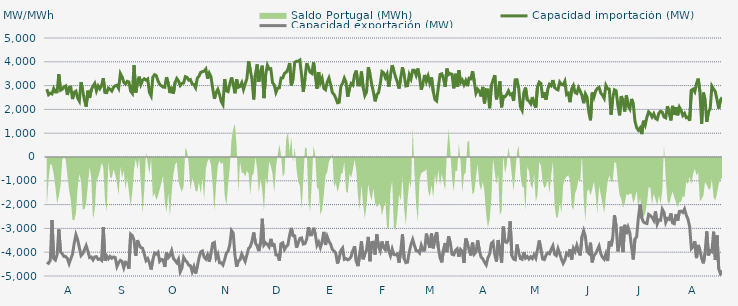
| Category | Capacidad importación (MW) | Capacidad exportación (MW) |
|---|---|---|
| 0 | 2850 | -4423.125 |
| 1900-01-01 | 2617.5 | -4466.25 |
| 1900-01-02 | 2681.25 | -4346.25 |
| 1900-01-03 | 2650 | -2650 |
| 1900-01-04 | 2876.25 | -4267.5 |
| 1900-01-05 | 2733.333 | -4333.125 |
| 1900-01-06 | 2735.625 | -4098.75 |
| 1900-01-07 | 3479.167 | -3041.667 |
| 1900-01-08 | 2805 | -3984.375 |
| 1900-01-09 | 2846.25 | -4065 |
| 1900-01-10 | 2941.875 | -4177.5 |
| 1900-01-11 | 2985 | -4183.125 |
| 1900-01-12 | 2606.25 | -4265.625 |
| 1900-01-13 | 2921.25 | -4481.25 |
| 1900-01-14 | 2938.125 | -4273.125 |
| 1900-01-15 | 2435 | -4091.25 |
| 1900-01-16 | 2716.875 | -3618.75 |
| 1900-01-17 | 2767.5 | -3264.375 |
| 1900-01-18 | 2476.875 | -3474.375 |
| 1900-01-19 | 2349.375 | -3798.75 |
| 1900-01-20 | 3142.5 | -4141.875 |
| 1900-01-21 | 2773.125 | -4066.875 |
| 1900-01-22 | 2390.625 | -3896.25 |
| 1900-01-23 | 2113.125 | -3723.75 |
| 1900-01-24 | 2786.25 | -3954.375 |
| 1900-01-25 | 2480.625 | -4226.25 |
| 1900-01-26 | 2829.375 | -4203.75 |
| 1900-01-27 | 2973.75 | -4323.75 |
| 1900-01-28 | 3090 | -4200 |
| 1900-01-29 | 2778.75 | -4186.875 |
| 1900-01-30 | 2986.875 | -4305 |
| 1900-01-31 | 2868.75 | -4282.5 |
| 1900-02-01 | 3000 | -4340.625 |
| 1900-02-02 | 3307.5 | -2947.5 |
| 1900-02-03 | 2713.125 | -4359.375 |
| 1900-02-04 | 2701.875 | -4158.75 |
| 1900-02-05 | 2896.875 | -4276.875 |
| 1900-02-06 | 2842.5 | -4177.5 |
| 1900-02-07 | 2773.125 | -4254.375 |
| 1900-02-08 | 2930.625 | -4201.875 |
| 1900-02-09 | 2990.625 | -4224.375 |
| 1900-02-10 | 3015 | -4603.125 |
| 1900-02-11 | 2883.75 | -4436.25 |
| 1900-02-12 | 3506.25 | -4342.5 |
| 1900-02-13 | 3367.5 | -4393.125 |
| 1900-02-14 | 3144.375 | -4653.75 |
| 1900-02-15 | 3063.75 | -4419.375 |
| 1900-02-16 | 3178.125 | -4456.875 |
| 1900-02-17 | 3153.75 | -4695 |
| 1900-02-18 | 2768.542 | -3240.125 |
| 1900-02-19 | 2672.083 | -3304.625 |
| 1900-02-20 | 3855 | -3498.75 |
| 1900-02-21 | 2703.125 | -4151.25 |
| 1900-02-22 | 3123.333 | -3495.125 |
| 1900-02-23 | 3376.875 | -3697.5 |
| 1900-02-24 | 3048.75 | -3805.875 |
| 1900-02-25 | 3225 | -3836.25 |
| 1900-02-26 | 3286.875 | -4085.625 |
| 1900-02-27 | 3230.625 | -4353.75 |
| 1900-02-28 | 3279.375 | -4267.5 |
| 1900-02-28 | 2704.917 | -4449.375 |
| 1900-03-01 | 2563.833 | -4725 |
| 1900-03-02 | 3360 | -4325.625 |
| 1900-03-03 | 3457.5 | -4035 |
| 1900-03-04 | 3420 | -4078.125 |
| 1900-03-05 | 3202.5 | -4005 |
| 1900-03-06 | 3050.625 | -4383.75 |
| 1900-03-07 | 2992.5 | -4301.25 |
| 1900-03-08 | 2938.125 | -4320 |
| 1900-03-09 | 2928.75 | -4614.375 |
| 1900-03-10 | 3356.25 | -4010.625 |
| 1900-03-11 | 3093.75 | -4231.875 |
| 1900-03-12 | 2686.875 | -4143.75 |
| 1900-03-13 | 2947.5 | -3935.625 |
| 1900-03-14 | 2664.375 | -4254.375 |
| 1900-03-15 | 3127.5 | -4350 |
| 1900-03-16 | 3300 | -4443.75 |
| 1900-03-17 | 3198.542 | -4296 |
| 1900-03-18 | 3001.875 | -4828.125 |
| 1900-03-19 | 3088.125 | -4666.875 |
| 1900-03-20 | 3110.625 | -4215 |
| 1900-03-21 | 3373.125 | -4336.875 |
| 1900-03-22 | 3345 | -4417.5 |
| 1900-03-23 | 3226.875 | -4541.25 |
| 1900-03-24 | 3251.25 | -4569.375 |
| 1900-03-25 | 3069.375 | -4816.875 |
| 1900-03-26 | 3046.875 | -4610.625 |
| 1900-03-27 | 2910 | -4897.5 |
| 1900-03-28 | 3309.375 | -4593.75 |
| 1900-03-29 | 3399.792 | -4243 |
| 1900-03-30 | 3556.875 | -3988.125 |
| 1900-03-31 | 3585.6 | -3948.08 |
| 1900-04-01 | 3605.625 | -4208.542 |
| 1900-04-02 | 3697.5 | -4290 |
| 1900-04-03 | 3291.25 | -4115.625 |
| 1900-04-04 | 3523.125 | -4398.75 |
| 1900-04-05 | 3371.25 | -4055.625 |
| 1900-04-06 | 2883.75 | -3628.125 |
| 1900-04-07 | 2445 | -3590.625 |
| 1900-04-08 | 2711.25 | -4233.75 |
| 1900-04-09 | 2842.292 | -4080 |
| 1900-04-10 | 2631.042 | -4443.75 |
| 1900-04-11 | 2333.542 | -4443.75 |
| 1900-04-12 | 2201.25 | -4537.5 |
| 1900-04-13 | 3275.625 | -4314.375 |
| 1900-04-14 | 2778.75 | -4038.75 |
| 1900-04-15 | 2749.167 | -3955 |
| 1900-04-16 | 3064.375 | -3696.875 |
| 1900-04-17 | 3341.083 | -3091.583 |
| 1900-04-18 | 3070.042 | -3200 |
| 1900-04-19 | 2678.625 | -4117.917 |
| 1900-04-20 | 3264.375 | -4610.625 |
| 1900-04-21 | 2928.75 | -4363.125 |
| 1900-04-22 | 2966.25 | -4316.25 |
| 1900-04-23 | 3121.875 | -4074.375 |
| 1900-04-24 | 2836.875 | -4230 |
| 1900-04-25 | 3078.75 | -4385.625 |
| 1900-04-26 | 3281.25 | -4121.25 |
| 1900-04-27 | 4027.5 | -3836.25 |
| 1900-04-28 | 3646.875 | -3765 |
| 1900-04-29 | 3256.875 | -3536.25 |
| 1900-04-30 | 2419.833 | -3170.625 |
| 1900-05-01 | 3472.5 | -3611.25 |
| 1900-05-02 | 3890.625 | -3742.5 |
| 1900-05-03 | 3166.875 | -3954.375 |
| 1900-05-04 | 3577.5 | -3583.125 |
| 1900-05-05 | 3836 | -2595.625 |
| 1900-05-06 | 2475 | -3700 |
| 1900-05-07 | 3466.875 | -3605.625 |
| 1900-05-08 | 3856.875 | -3676.458 |
| 1900-05-09 | 3697.5 | -3778.125 |
| 1900-05-10 | 3708.75 | -3440.625 |
| 1900-05-11 | 3125.625 | -3712.5 |
| 1900-05-12 | 3026.792 | -3685.625 |
| 1900-05-13 | 2711.458 | -4111.875 |
| 1900-05-14 | 2894.583 | -4117.5 |
| 1900-05-15 | 2908.583 | -4353.75 |
| 1900-05-16 | 3321.875 | -3639.375 |
| 1900-05-17 | 3324.375 | -3603.75 |
| 1900-05-18 | 3515.833 | -3886.875 |
| 1900-05-19 | 3562.5 | -3763.125 |
| 1900-05-20 | 3684.792 | -3688.125 |
| 1900-05-21 | 3950.625 | -3281.25 |
| 1900-05-22 | 3006.042 | -2979.375 |
| 1900-05-23 | 3276.667 | -3305.625 |
| 1900-05-24 | 3978.75 | -3315 |
| 1900-05-25 | 4018.125 | -3806.25 |
| 1900-05-26 | 4020 | -3611.25 |
| 1900-05-27 | 4072.5 | -3421.458 |
| 1900-05-28 | 3435 | -3400.208 |
| 1900-05-29 | 2733.458 | -3658.125 |
| 1900-05-30 | 3328.542 | -3637.5 |
| 1900-05-31 | 3937.5 | -3451.875 |
| 1900-06-01 | 3746.25 | -2948.958 |
| 1900-06-02 | 3564.375 | -3273.75 |
| 1900-06-03 | 3513.75 | -3266.25 |
| 1900-06-04 | 3975 | -2973.75 |
| 1900-06-05 | 3418.125 | -3228.75 |
| 1900-06-06 | 2868.75 | -3712.5 |
| 1900-06-07 | 3568.125 | -3577.5 |
| 1900-06-08 | 3120 | -3802.5 |
| 1900-06-09 | 3305.625 | -3564.375 |
| 1900-06-10 | 2884.375 | -3145.875 |
| 1900-06-11 | 2826.25 | -3695.625 |
| 1900-06-12 | 3149.792 | -3346.875 |
| 1900-06-13 | 3321.458 | -3540 |
| 1900-06-14 | 3048.75 | -3665.625 |
| 1900-06-15 | 2704.25 | -3881.25 |
| 1900-06-16 | 2627.25 | -3950.625 |
| 1900-06-17 | 2475.708 | -4038.75 |
| 1900-06-18 | 2277.917 | -4477.5 |
| 1900-06-19 | 2300 | -4239.375 |
| 1900-06-20 | 2972.708 | -3928.125 |
| 1900-06-21 | 3093.75 | -3825 |
| 1900-06-22 | 3313.333 | -4297.5 |
| 1900-06-23 | 3141.75 | -4268.125 |
| 1900-06-24 | 2533.125 | -4321.875 |
| 1900-06-25 | 2863.375 | -4282.5 |
| 1900-06-26 | 3088.125 | -4185 |
| 1900-06-27 | 3024.375 | -3931.875 |
| 1900-06-28 | 3459.375 | -3751.875 |
| 1900-06-29 | 3630 | -4380 |
| 1900-06-30 | 3020.625 | -4586.25 |
| 1900-07-01 | 3020.625 | -4091.25 |
| 1900-07-02 | 3592.5 | -3540 |
| 1900-07-03 | 2925 | -4297.5 |
| 1900-07-04 | 2582.625 | -4080.542 |
| 1900-07-05 | 2730 | -3900.625 |
| 1900-07-06 | 3769.167 | -3357.25 |
| 1900-07-07 | 3498.625 | -4380 |
| 1900-07-08 | 3058.125 | -3591.583 |
| 1900-07-09 | 2735.625 | -3581.875 |
| 1900-07-10 | 2339.792 | -4096.875 |
| 1900-07-11 | 2622.625 | -3250.667 |
| 1900-07-12 | 2697.5 | -3770.625 |
| 1900-07-13 | 3064.167 | -3943.625 |
| 1900-07-14 | 3588.75 | -3549.375 |
| 1900-07-15 | 3535.75 | -3810 |
| 1900-07-16 | 3333.958 | -3898.125 |
| 1900-07-17 | 3486.625 | -3530.542 |
| 1900-07-18 | 2951.375 | -3943.125 |
| 1900-07-19 | 3439.375 | -4149.375 |
| 1900-07-20 | 3860.625 | -3864.375 |
| 1900-07-21 | 3609.583 | -4100.625 |
| 1900-07-22 | 3359.75 | -4110 |
| 1900-07-23 | 3152.25 | -4073.75 |
| 1900-07-24 | 2876.25 | -4441.875 |
| 1900-07-25 | 3331.25 | -3948.75 |
| 1900-07-26 | 3768.75 | -3251.25 |
| 1900-07-27 | 3435.667 | -4269.375 |
| 1900-07-28 | 2984.167 | -4438.125 |
| 1900-07-29 | 2998.583 | -4415.625 |
| 1900-07-30 | 3457.333 | -3980.625 |
| 1900-07-31 | 3283.042 | -3676.875 |
| 1900-08-01 | 3641.25 | -3464.5 |
| 1900-08-02 | 3640.708 | -3708.75 |
| 1900-08-03 | 3435.708 | -3937.5 |
| 1900-08-04 | 3718.125 | -3943.125 |
| 1900-08-05 | 3344.458 | -4031.25 |
| 1900-08-06 | 2827.083 | -3710.625 |
| 1900-08-07 | 3113.75 | -3920.625 |
| 1900-08-08 | 3448.125 | -3913.125 |
| 1900-08-09 | 3172.083 | -3219.375 |
| 1900-08-10 | 3397.5 | -3562.5 |
| 1900-08-11 | 3101.042 | -3819.375 |
| 1900-08-12 | 3341.25 | -3215.625 |
| 1900-08-13 | 2760.833 | -3838.125 |
| 1900-08-14 | 2417.5 | -3395.625 |
| 1900-08-15 | 2354.583 | -3155.625 |
| 1900-08-16 | 2936.875 | -3811.875 |
| 1900-08-17 | 3468.75 | -4241.25 |
| 1900-08-18 | 3495 | -4426.875 |
| 1900-08-19 | 3297.083 | -3890.625 |
| 1900-08-20 | 2946.292 | -3613.125 |
| 1900-08-21 | 3714.792 | -3997.5 |
| 1900-08-22 | 3460.833 | -3331.875 |
| 1900-08-23 | 3502.917 | -3618.5 |
| 1900-08-24 | 3472.5 | -4089.375 |
| 1900-08-25 | 2885.87 | -4111.304 |
| 1900-08-26 | 3496.875 | -3930 |
| 1900-08-27 | 2942.5 | -3858.75 |
| 1900-08-28 | 3650.625 | -4194.375 |
| 1900-08-29 | 3122.458 | -3885 |
| 1900-08-30 | 3230.042 | -3961.875 |
| 1900-08-31 | 3034.208 | -4453.125 |
| 1900-09-01 | 3206.25 | -3423.75 |
| 1900-09-02 | 2977.5 | -3611.25 |
| 1900-09-03 | 3309.375 | -3911.25 |
| 1900-09-04 | 3288.75 | -4138.125 |
| 1900-09-05 | 3602.833 | -3596.25 |
| 1900-09-06 | 3174.375 | -4080 |
| 1900-09-07 | 2683.667 | -3991.875 |
| 1900-09-08 | 2848.875 | -3504.833 |
| 1900-09-09 | 2758.542 | -3938.333 |
| 1900-09-10 | 2545.417 | -4209.375 |
| 1900-09-11 | 2945.625 | -4278.75 |
| 1900-09-12 | 2252.5 | -4423.125 |
| 1900-09-13 | 2829.375 | -4533.75 |
| 1900-09-14 | 2820.917 | -4235.625 |
| 1900-09-15 | 2048.125 | -4081.208 |
| 1900-09-16 | 3003.75 | -3632.292 |
| 1900-09-17 | 3232.5 | -3565.625 |
| 1900-09-18 | 3440.625 | -4096.875 |
| 1900-09-19 | 2422.5 | -4393.125 |
| 1900-09-20 | 2763.958 | -3487.5 |
| 1900-09-21 | 3183.75 | -3943.125 |
| 1900-09-22 | 2087.083 | -4443.75 |
| 1900-09-23 | 2547 | -2925.75 |
| 1900-09-24 | 2531.667 | -3560.625 |
| 1900-09-25 | 2628.75 | -3590.625 |
| 1900-09-26 | 2778.75 | -3480 |
| 1900-09-27 | 2617.292 | -2701.792 |
| 1900-09-28 | 2655 | -4141.875 |
| 1900-09-29 | 2355.417 | -4288.125 |
| 1900-09-30 | 3240.75 | -4318.125 |
| 1900-10-01 | 3247.5 | -3676.875 |
| 1900-10-02 | 2878.042 | -4025.625 |
| 1900-10-03 | 2109.167 | -4269.375 |
| 1900-10-04 | 1961.042 | -4299.375 |
| 1900-10-05 | 2710.208 | -4003.125 |
| 1900-10-06 | 2916 | -4248.333 |
| 1900-10-07 | 2401.875 | -4179.375 |
| 1900-10-08 | 2351.25 | -4286.25 |
| 1900-10-09 | 2238.75 | -4192.5 |
| 1900-10-10 | 2520 | -4265.625 |
| 1900-10-11 | 2227.5 | -4108.125 |
| 1900-10-12 | 2070.583 | -4246.875 |
| 1900-10-13 | 2958.75 | -3892.5 |
| 1900-10-14 | 3146.25 | -3508.125 |
| 1900-10-15 | 3087.5 | -3877.5 |
| 1900-10-16 | 2487.5 | -4284.375 |
| 1900-10-17 | 2722.5 | -4310.625 |
| 1900-10-18 | 2411.25 | -4125 |
| 1900-10-19 | 2840.5 | -4025.625 |
| 1900-10-20 | 3054.5 | -4066.875 |
| 1900-10-21 | 2992.958 | -3879.375 |
| 1900-10-22 | 3232.5 | -3729.375 |
| 1900-10-23 | 2917.5 | -4085.625 |
| 1900-10-24 | 2853.75 | -4141.875 |
| 1900-10-25 | 2819.458 | -3849.375 |
| 1900-10-26 | 3145.042 | -4061.25 |
| 1900-10-27 | 3046.958 | -4290 |
| 1900-10-28 | 3028.125 | -4468.125 |
| 1900-10-29 | 3180.542 | -4331.25 |
| 1900-10-30 | 2624.958 | -4042.5 |
| 1900-10-31 | 2676.25 | -4115.625 |
| 1900-11-01 | 2302.5 | -3873.75 |
| 1900-11-02 | 2854.208 | -4308.75 |
| 1900-11-03 | 2997.833 | -3837.167 |
| 1900-11-04 | 2709.375 | -3973.125 |
| 1900-11-05 | 2670 | -3712.958 |
| 1900-11-06 | 2913.75 | -3958.125 |
| 1900-11-07 | 2765.625 | -4134.375 |
| 1900-11-08 | 2587.5 | -3352.5 |
| 1900-11-09 | 2261.25 | -3093.75 |
| 1900-11-10 | 2651.25 | -3345.208 |
| 1900-11-11 | 2510.625 | -3963.75 |
| 1900-11-12 | 1885.875 | -4044.375 |
| 1900-11-13 | 1541.5 | -3601.375 |
| 1900-11-14 | 2707.5 | -4426.875 |
| 1900-11-15 | 2516.25 | -4128.75 |
| 1900-11-16 | 2775 | -4059.375 |
| 1900-11-17 | 2883.75 | -3906.667 |
| 1900-11-18 | 2930.625 | -3742.5 |
| 1900-11-19 | 2685 | -4061.25 |
| 1900-11-20 | 2596.875 | -4213.125 |
| 1900-11-21 | 2463.75 | -4295.625 |
| 1900-11-22 | 3005.625 | -4065 |
| 1900-11-23 | 2861.25 | -4370.625 |
| 1900-11-24 | 2855.083 | -3533.583 |
| 1900-11-25 | 1775.625 | -3751.875 |
| 1900-11-26 | 2478.75 | -3391.875 |
| 1900-11-27 | 2821.875 | -2444.375 |
| 1900-11-28 | 2782.5 | -2903.75 |
| 1900-11-29 | 2169.375 | -3964.667 |
| 1900-11-30 | 1751.292 | -3614.625 |
| 1900-12-01 | 2561.25 | -2926.875 |
| 1900-12-02 | 2356.875 | -3995.625 |
| 1900-12-03 | 1911.125 | -2849.625 |
| 1900-12-04 | 2583.75 | -3240 |
| 1900-12-05 | 2157.125 | -2962.917 |
| 1900-12-06 | 2021.375 | -3195.625 |
| 1900-12-07 | 2439.375 | -3776.25 |
| 1900-12-08 | 2235 | -4305 |
| 1900-12-09 | 1509.375 | -3436.875 |
| 1900-12-10 | 1230.208 | -3360 |
| 1900-12-11 | 1123.125 | -2546.875 |
| 1900-12-12 | 1221.25 | -1995.875 |
| 1900-12-13 | 962.083 | -2563.125 |
| 1900-12-14 | 1523.958 | -2728.125 |
| 1900-12-15 | 1344.375 | -2776.875 |
| 1900-12-16 | 1676.25 | -2795.625 |
| 1900-12-17 | 1899.375 | -2411.25 |
| 1900-12-18 | 1826.25 | -2461.875 |
| 1900-12-19 | 1680 | -2529.375 |
| 1900-12-20 | 1815 | -2662.5 |
| 1900-12-21 | 1621.458 | -2287.5 |
| 1900-12-22 | 1577.083 | -2818.125 |
| 1900-12-23 | 1846.875 | -2643.75 |
| 1900-12-24 | 1923.75 | -2656.875 |
| 1900-12-25 | 1875 | -2195.625 |
| 1900-12-26 | 1683.75 | -2330.625 |
| 1900-12-27 | 1646.25 | -2746.875 |
| 1900-12-28 | 2137.5 | -2580.5 |
| 1900-12-29 | 1860 | -2620.625 |
| 1900-12-30 | 1537.5 | -2371.875 |
| 1900-12-31 | 2149.292 | -2771.25 |
| 1901-01-01 | 1766.25 | -2801.25 |
| 1901-01-02 | 2097.75 | -2405.625 |
| 1901-01-03 | 1753.125 | -2676.75 |
| 1901-01-04 | 2090.625 | -2285.292 |
| 1901-01-05 | 1956.125 | -2274.75 |
| 1901-01-06 | 1743.75 | -2330.125 |
| 1901-01-07 | 1833.75 | -2185.875 |
| 1901-01-08 | 1651.875 | -2439.375 |
| 1901-01-09 | 1677 | -2608.125 |
| 1901-01-10 | 1526.25 | -2926.875 |
| 1901-01-11 | 2806.875 | -3847.5 |
| 1901-01-12 | 2853.75 | -3770.625 |
| 1901-01-13 | 2739.375 | -3542.5 |
| 1901-01-14 | 3086.25 | -4248.75 |
| 1901-01-15 | 3294.375 | -3694.583 |
| 1901-01-16 | 2737.5 | -3914.167 |
| 1901-01-17 | 1388.958 | -4258.125 |
| 1901-01-18 | 2705.625 | -4468.125 |
| 1901-01-19 | 2414.25 | -4032.292 |
| 1901-01-20 | 1474.5 | -3127.5 |
| 1901-01-21 | 1904.833 | -4134.375 |
| 1901-01-22 | 2018.333 | -3933.75 |
| 1901-01-23 | 2978.625 | -3980.625 |
| 1901-01-24 | 2851.875 | -3137.917 |
| 1901-01-25 | 2745 | -4327.5 |
| 1901-01-26 | 2411.25 | -3294.375 |
| 1901-01-27 | 2032.5 | -4693.125 |
| 1901-01-28 | 2394.375 | -4916.25 |
| 1901-01-29 | 2506.875 | -4770 |